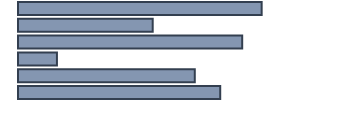
| Category | Percentatge  |
|---|---|
| 0 | 77.6 |
| 1 | 42.9 |
| 2 | 71.4 |
| 3 | 12.4 |
| 4 | 56.3 |
| 5 | 64.4 |